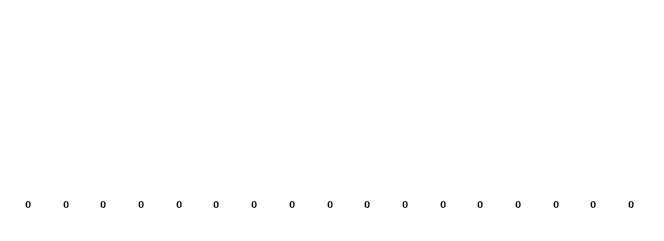
| Category | % grupy |
|---|---|
| 0 | 0 |
| 1 | 0 |
| 2 | 0 |
| 3 | 0 |
| 4 | 0 |
| 5 | 0 |
| 6 | 0 |
| 7 | 0 |
| 8 | 0 |
| 9 | 0 |
| 10 | 0 |
| 11 | 0 |
| 12 | 0 |
| 13 | 0 |
| 14 | 0 |
| 15 | 0 |
| 16 | 0 |